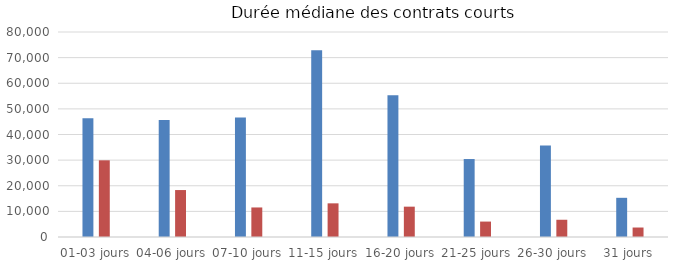
| Category | Recours faible ou modéré | Recours intensif |
|---|---|---|
| 01-03 jours | 46306 | 29926 |
| 04-06 jours | 45655 | 18323 |
| 07-10 jours | 46658 | 11527 |
| 11-15 jours | 72897 | 13134 |
| 16-20 jours | 55288 | 11840 |
| 21-25 jours | 30426 | 6020 |
| 26-30 jours | 35678 | 6730 |
| 31 jours | 15292 | 3700 |